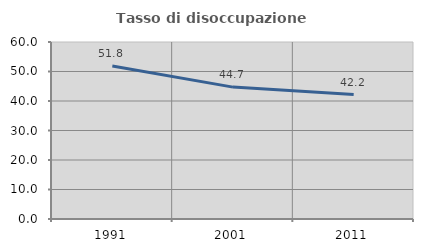
| Category | Tasso di disoccupazione giovanile  |
|---|---|
| 1991.0 | 51.838 |
| 2001.0 | 44.708 |
| 2011.0 | 42.18 |